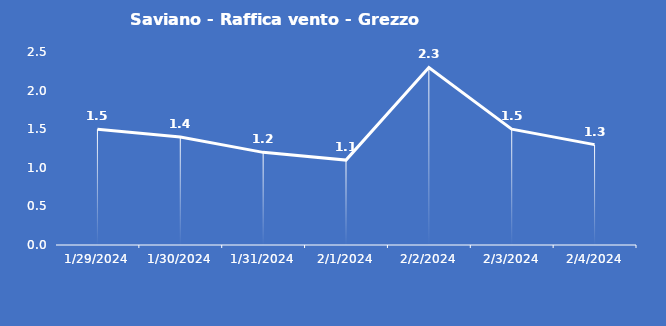
| Category | Saviano - Raffica vento - Grezzo (m/s) |
|---|---|
| 1/29/24 | 1.5 |
| 1/30/24 | 1.4 |
| 1/31/24 | 1.2 |
| 2/1/24 | 1.1 |
| 2/2/24 | 2.3 |
| 2/3/24 | 1.5 |
| 2/4/24 | 1.3 |